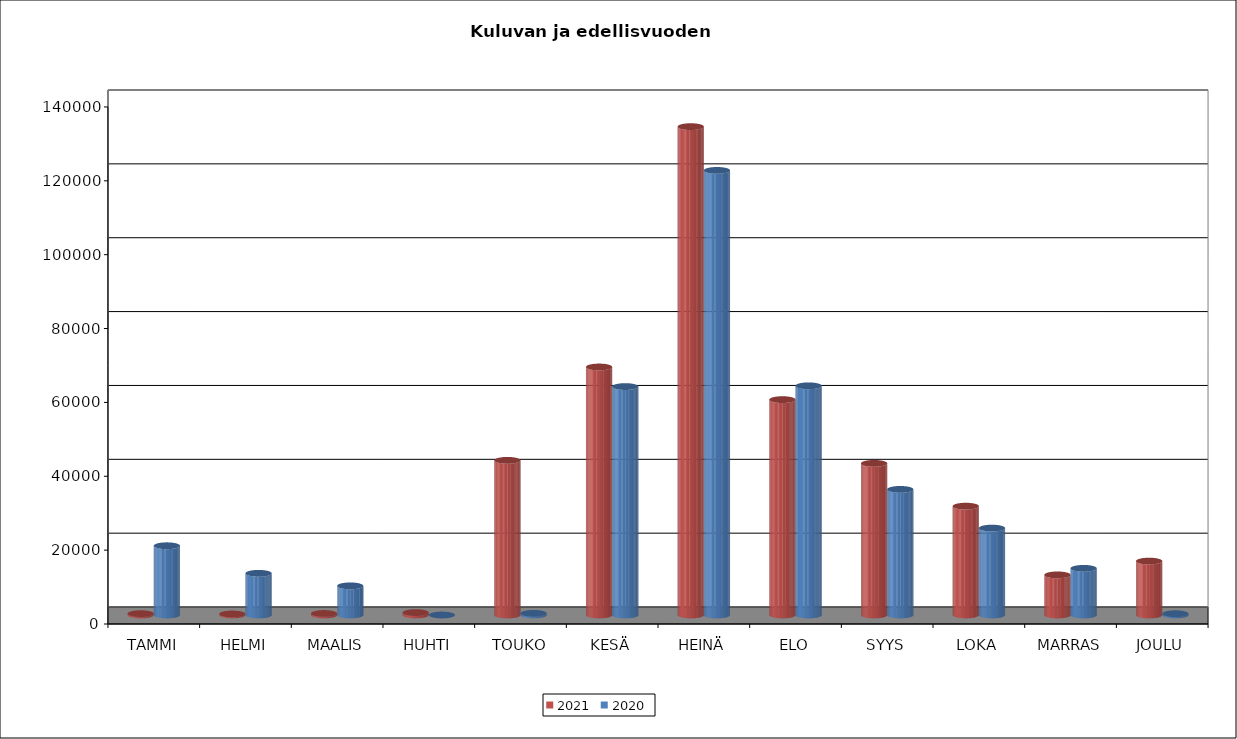
| Category | 2021 | 2020 |
|---|---|---|
| TAMMI | 367 | 18749 |
| HELMI | 281 | 11286 |
| MAALIS | 410 | 7892 |
| HUHTI | 656 | 0 |
| TOUKO | 41880 | 452 |
| KESÄ | 67157 | 61851 |
| HEINÄ | 132229 | 120384 |
| ELO | 58316 | 62057 |
| SYYS | 41060 | 34016 |
| LOKA | 29470 | 23526 |
| MARRAS | 10864 | 12633 |
| JOULU | 14596 | 348 |